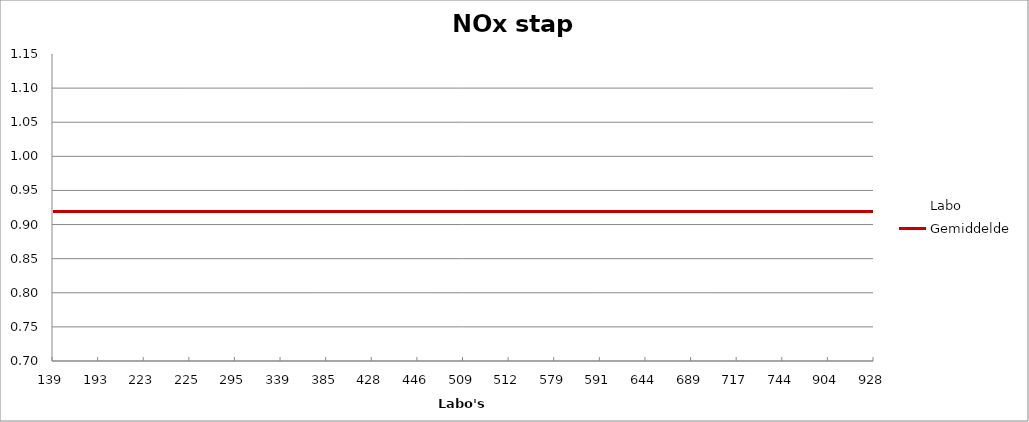
| Category | Labo | Gemiddelde |
|---|---|---|
| 139.0 | 0.98 | 0.919 |
| 193.0 | 0.943 | 0.919 |
| 223.0 | 0.973 | 0.919 |
| 225.0 | 0.837 | 0.919 |
| 295.0 | 0.968 | 0.919 |
| 339.0 | 0.867 | 0.919 |
| 385.0 | 0.92 | 0.919 |
| 428.0 | 0.971 | 0.919 |
| 446.0 | 0.941 | 0.919 |
| 509.0 | 0.913 | 0.919 |
| 512.0 | 0.839 | 0.919 |
| 579.0 | 0.98 | 0.919 |
| 591.0 | 1.139 | 0.919 |
| 644.0 | 1.026 | 0.919 |
| 689.0 | 0.848 | 0.919 |
| 717.0 | 0.748 | 0.919 |
| 744.0 | 0.938 | 0.919 |
| 904.0 | 0.807 | 0.919 |
| 928.0 | 0.872 | 0.919 |